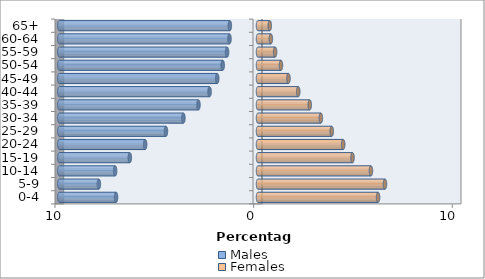
| Category | Males | Females |
|---|---|---|
| 0-4 | -7.143 | 6.045 |
| 5-9 | -8.01 | 6.392 |
| 10-14 | -7.192 | 5.685 |
| 15-19 | -6.452 | 4.757 |
| 20-24 | -5.68 | 4.289 |
| 25-29 | -4.633 | 3.711 |
| 30-34 | -3.755 | 3.164 |
| 35-39 | -2.997 | 2.604 |
| 40-44 | -2.438 | 2.026 |
| 45-49 | -2.052 | 1.534 |
| 50-54 | -1.777 | 1.155 |
| 55-59 | -1.557 | 0.86 |
| 60-64 | -1.436 | 0.647 |
| 65+ | -1.417 | 0.592 |